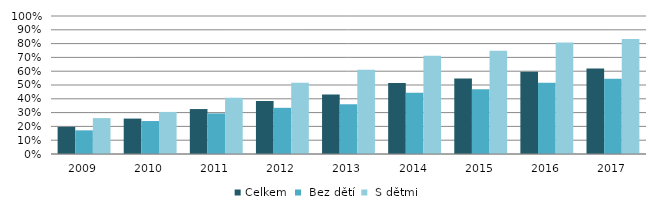
| Category | Celkem |  Bez dětí |  S dětmi |
|---|---|---|---|
| 2009.0 | 0.196 | 0.171 | 0.26 |
| 2010.0 | 0.257 | 0.239 | 0.305 |
| 2011.0 | 0.326 | 0.294 | 0.408 |
| 2012.0 | 0.384 | 0.335 | 0.516 |
| 2013.0 | 0.431 | 0.36 | 0.611 |
| 2014.0 | 0.515 | 0.444 | 0.712 |
| 2015.0 | 0.547 | 0.47 | 0.749 |
| 2016.0 | 0.596 | 0.516 | 0.808 |
| 2017.0 | 0.62 | 0.545 | 0.834 |